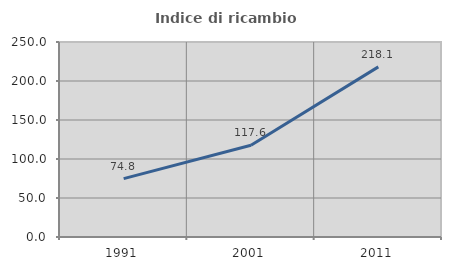
| Category | Indice di ricambio occupazionale  |
|---|---|
| 1991.0 | 74.845 |
| 2001.0 | 117.585 |
| 2011.0 | 218.119 |